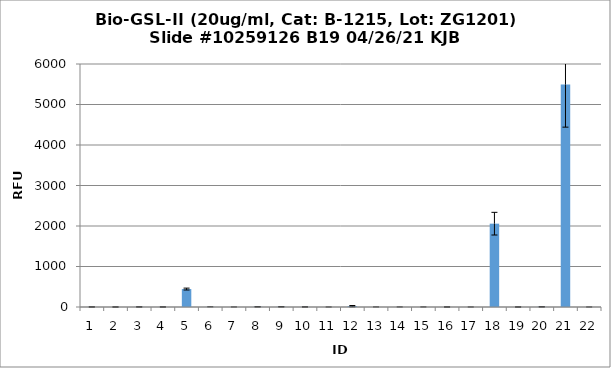
| Category | Series 0 |
|---|---|
| 0 | 1.25 |
| 1 | 0.5 |
| 2 | 2 |
| 3 | 1 |
| 4 | 443 |
| 5 | 2 |
| 6 | 0 |
| 7 | 4.5 |
| 8 | 5 |
| 9 | 2 |
| 10 | 0.25 |
| 11 | 20.5 |
| 12 | 0.75 |
| 13 | 0.25 |
| 14 | 0.75 |
| 15 | 0.75 |
| 16 | 0.25 |
| 17 | 2057.5 |
| 18 | 0.5 |
| 19 | 4 |
| 20 | 5494 |
| 21 | 0.25 |